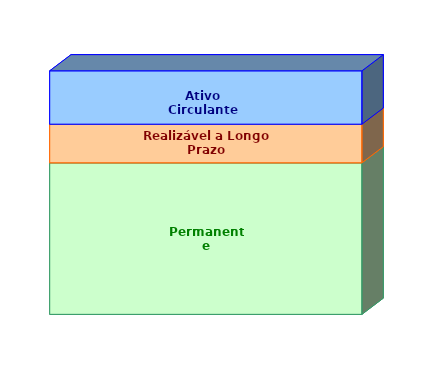
| Category | Permanente | Realizável a Longo Prazo | Ativo Circulante |
|---|---|---|---|
| 0 | 0.622 | 0.159 | 0.219 |